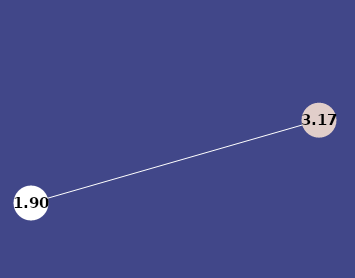
| Category | Series 0 |
|---|---|
| 0 | 1.901 |
| 1 | 3.165 |